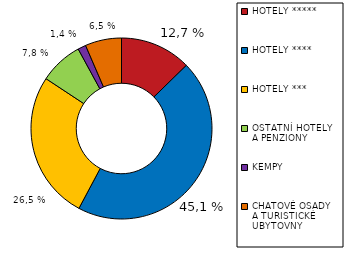
| Category | Series 0 |
|---|---|
| HOTELY ***** | 0.127 |
| HOTELY **** | 0.451 |
| HOTELY *** | 0.265 |
| OSTATNÍ HOTELY 
A PENZIONY | 0.078 |
| KEMPY | 0.014 |
| CHATOVÉ OSADY 
A TURISTICKÉ UBYTOVNY  | 0.065 |